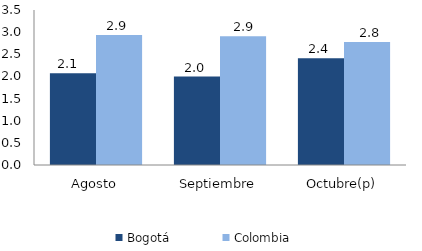
| Category | Bogotá | Colombia |
|---|---|---|
| Agosto | 2.071 | 2.934 |
| Septiembre | 1.998 | 2.905 |
| Octubre(p) | 2.411 | 2.777 |